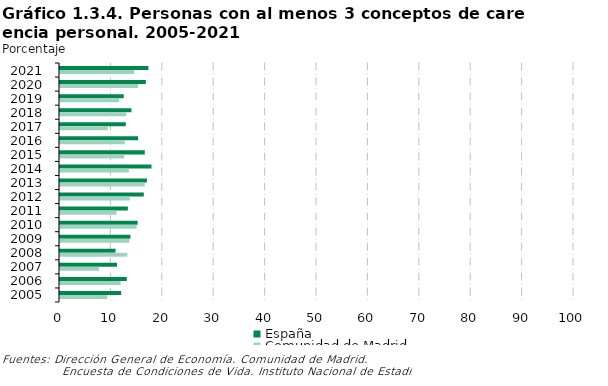
| Category | España | Comunidad de Madrid |
|---|---|---|
| 2021 | 17.2 | 14.4 |
| 2020 | 16.7 | 15.2 |
| 2019 | 12.4 | 11.5 |
| 2018 | 13.9 | 12.9 |
| 2017 | 12.8 | 9.3 |
| 2016 | 15.2 | 12.6 |
| 2015 | 16.5 | 12.5 |
| 2014 | 17.8 | 13.4 |
| 2013 | 16.9 | 16.5 |
| 2012 | 16.3 | 13.6 |
| 2011 | 13.2 | 11 |
| 2010 | 15.1 | 14.9 |
| 2009 | 13.7 | 13.5 |
| 2008 | 10.8 | 13.1 |
| 2007 | 11.1 | 7.6 |
| 2006 | 13 | 11.8 |
| 2005 | 11.9 | 9.2 |